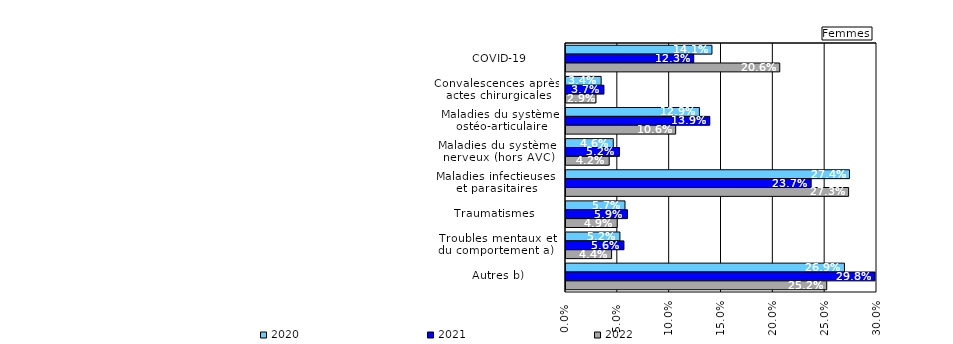
| Category | 2020 | 2021 | 2022 |
|---|---|---|---|
| COVID-19          | 0.141 | 0.123 | 0.206 |
| Convalescences après
 actes chirurgicales | 0.034 | 0.037 | 0.029 |
| Maladies du système
 ostéo-articulaire | 0.129 | 0.139 | 0.106 |
| Maladies du système 
nerveux (hors AVC) | 0.046 | 0.052 | 0.042 |
| Maladies infectieuses 
et parasitaires | 0.274 | 0.236 | 0.273 |
| Traumatismes        | 0.057 | 0.059 | 0.049 |
| Troubles mentaux et 
du comportement a)   | 0.052 | 0.056 | 0.044 |
| Autres b)           | 0.269 | 0.298 | 0.252 |